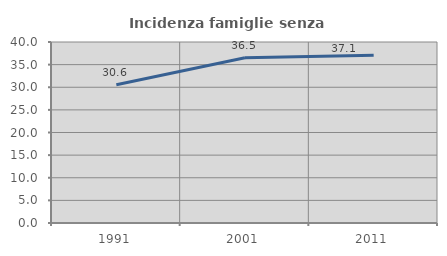
| Category | Incidenza famiglie senza nuclei |
|---|---|
| 1991.0 | 30.558 |
| 2001.0 | 36.528 |
| 2011.0 | 37.082 |